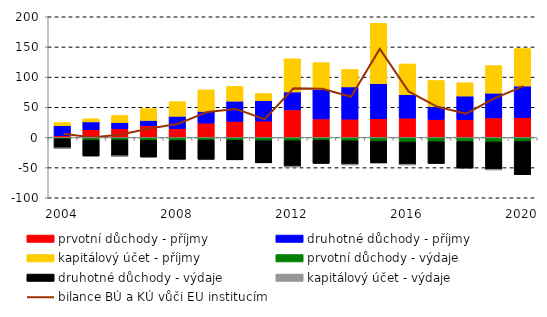
| Category | prvotní důchody - příjmy | druhotné důchody - příjmy | kapitálový účet - příjmy | prvotní důchody - výdaje | druhotné důchody - výdaje | kapitálový účet - výdaje |
|---|---|---|---|---|---|---|
| 2004 | 2813.745 | 16653.959 | 5175.794 | -1910.086 | -16067.334 | -0.899 |
| 2005 | 12739.267 | 13065.558 | 5180.611 | -4373.728 | -26475.798 | 0 |
| 2006 | 14250.981 | 10238.261 | 12005.84 | -4233.003 | -26850.174 | -45.925 |
| 2007 | 19238.716 | 8945.791 | 19625.492 | -4967.636 | -27582.853 | 0 |
| 2008 | 14659.321 | 20481.121 | 24191.522 | -5178.004 | -31037.324 | 0 |
| 2009 | 23850.844 | 19318.111 | 35761.806 | -4441.197 | -31854.518 | 0 |
| 2010 | 26688.42 | 33436.11 | 24500.05 | -4791.473 | -32333.823 | 0 |
| 2011 | 27111.993 | 33761.239 | 11968.474 | -5416.196 | -36696.875 | 0 |
| 2012 | 45687.224 | 29688.811 | 55039.996 | -5384.315 | -43043.329 | -3.64 |
| 2013 | 30666.913 | 48802.736 | 44549.908 | -4431.919 | -38640.61 | 0 |
| 2014 | 30349.755 | 53415.104 | 29086.827 | -5448.216 | -39581.544 | -3.157 |
| 2015 | 30962.259 | 58177.176 | 100192.201 | -6169.563 | -36117.151 | 0 |
| 2016 | 32123.825 | 38778.291 | 50916.176 | -7502.088 | -37600.511 | -14.824 |
| 2017 | 29723.199 | 21619.752 | 43058.108 | -7055.943 | -36123.377 | 0 |
| 2018 | 29463.855 | 39175.935 | 22034.92 | -6847.708 | -43991.423 | 0 |
| 2019 | 32445.509 | 40925.444 | 45758.091 | -7367.808 | -46046.516 | -39.34 |
| 2020 | 33088.081 | 52119.834 | 62098.1 | -6592.607 | -55234.825 | 0 |